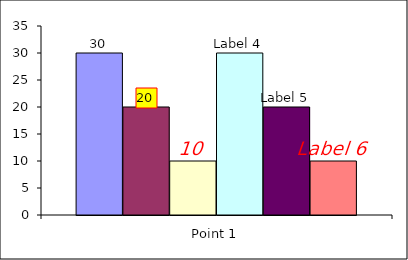
| Category | Series 1 | Series 2 | Series 3 | Series 4 | Series 5 | Series 6 |
|---|---|---|---|---|---|---|
| Point 1 | 30 | 20 | 10 | 30 | 20 | 10 |